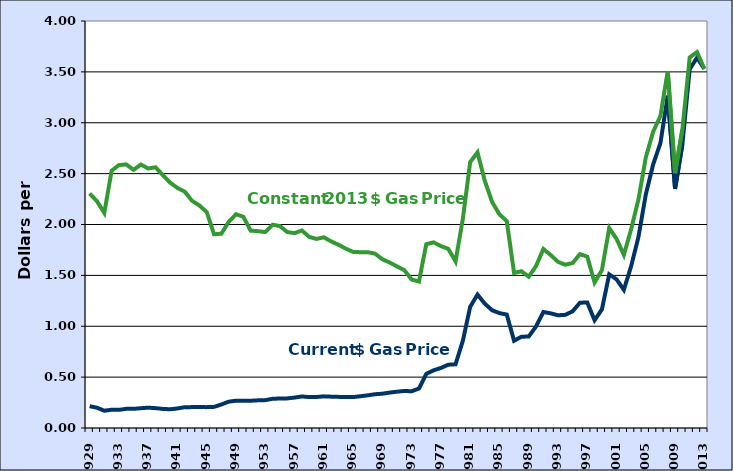
| Category | Series 0 | Series 1 |
|---|---|---|
| 1929.0 | 0.214 | 2.305 |
| 1930.0 | 0.199 | 2.228 |
| 1931.0 | 0.17 | 2.114 |
| 1932.0 | 0.179 | 2.528 |
| 1933.0 | 0.178 | 2.584 |
| 1934.0 | 0.188 | 2.59 |
| 1935.0 | 0.188 | 2.537 |
| 1936.0 | 0.194 | 2.589 |
| 1937.0 | 0.2 | 2.551 |
| 1938.0 | 0.195 | 2.562 |
| 1939.0 | 0.188 | 2.486 |
| 1940.0 | 0.184 | 2.411 |
| 1941.0 | 0.192 | 2.359 |
| 1942.0 | 0.204 | 2.322 |
| 1943.0 | 0.205 | 2.232 |
| 1944.0 | 0.206 | 2.187 |
| 1945.0 | 0.205 | 2.122 |
| 1946.0 | 0.208 | 1.904 |
| 1947.0 | 0.231 | 1.909 |
| 1948.0 | 0.259 | 2.026 |
| 1949.0 | 0.268 | 2.101 |
| 1950.0 | 0.268 | 2.076 |
| 1951.0 | 0.268 | 1.939 |
| 1952.0 | 0.272 | 1.935 |
| 1953.0 | 0.274 | 1.925 |
| 1954.0 | 0.287 | 1.998 |
| 1955.0 | 0.29 | 1.985 |
| 1956.0 | 0.291 | 1.926 |
| 1957.0 | 0.299 | 1.915 |
| 1958.0 | 0.31 | 1.942 |
| 1959.0 | 0.304 | 1.878 |
| 1960.0 | 0.305 | 1.858 |
| 1961.0 | 0.311 | 1.874 |
| 1962.0 | 0.308 | 1.834 |
| 1963.0 | 0.306 | 1.801 |
| 1964.0 | 0.304 | 1.763 |
| 1965.0 | 0.304 | 1.731 |
| 1966.0 | 0.312 | 1.728 |
| 1967.0 | 0.321 | 1.728 |
| 1968.0 | 0.332 | 1.714 |
| 1969.0 | 0.337 | 1.658 |
| 1970.0 | 0.348 | 1.627 |
| 1971.0 | 0.357 | 1.588 |
| 1972.0 | 0.364 | 1.552 |
| 1973.0 | 0.361 | 1.459 |
| 1974.0 | 0.388 | 1.439 |
| 1975.0 | 0.532 | 1.806 |
| 1976.0 | 0.567 | 1.825 |
| 1977.0 | 0.59 | 1.788 |
| 1978.0 | 0.622 | 1.761 |
| 1979.0 | 0.626 | 1.637 |
| 1980.0 | 0.857 | 2.056 |
| 1981.0 | 1.191 | 2.614 |
| 1982.0 | 1.311 | 2.709 |
| 1983.0 | 1.222 | 2.429 |
| 1984.0 | 1.157 | 2.221 |
| 1985.0 | 1.129 | 2.1 |
| 1986.0 | 1.115 | 2.033 |
| 1987.0 | 0.857 | 1.524 |
| 1988.0 | 0.897 | 1.541 |
| 1989.0 | 0.899 | 1.487 |
| 1990.0 | 0.998 | 1.591 |
| 1991.0 | 1.14 | 1.759 |
| 1992.0 | 1.127 | 1.7 |
| 1993.0 | 1.108 | 1.633 |
| 1994.0 | 1.112 | 1.605 |
| 1995.0 | 1.147 | 1.621 |
| 1996.0 | 1.231 | 1.709 |
| 1997.0 | 1.234 | 1.684 |
| 1998.0 | 1.059 | 1.43 |
| 1999.0 | 1.165 | 1.551 |
| 2000.0 | 1.51 | 1.965 |
| 2001.0 | 1.461 | 1.859 |
| 2002.0 | 1.358 | 1.702 |
| 2003.0 | 1.591 | 1.955 |
| 2004.0 | 1.88 | 2.248 |
| 2005.0 | 2.295 | 2.659 |
| 2006.0 | 2.589 | 2.91 |
| 2007.0 | 2.801 | 3.067 |
| 2008.0 | 3.266 | 3.508 |
| 2009.0 | 2.35 | 2.505 |
| 2010.0 | 2.788 | 2.936 |
| 2011.0 | 3.527 | 3.643 |
| 2012.0 | 3.64 | 3.695 |
| 2013.0 | 3.53 | 3.53 |